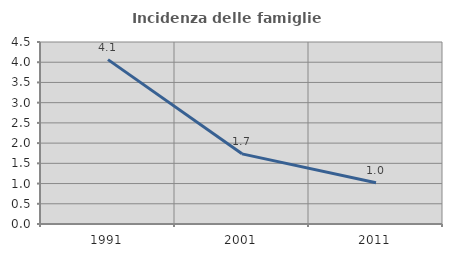
| Category | Incidenza delle famiglie numerose |
|---|---|
| 1991.0 | 4.064 |
| 2001.0 | 1.735 |
| 2011.0 | 1.02 |